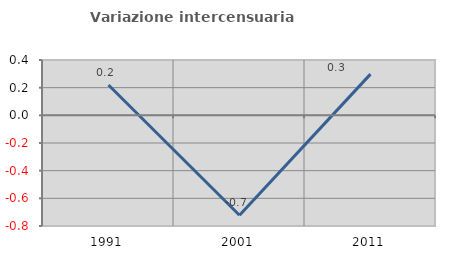
| Category | Variazione intercensuaria annua |
|---|---|
| 1991.0 | 0.219 |
| 2001.0 | -0.723 |
| 2011.0 | 0.298 |